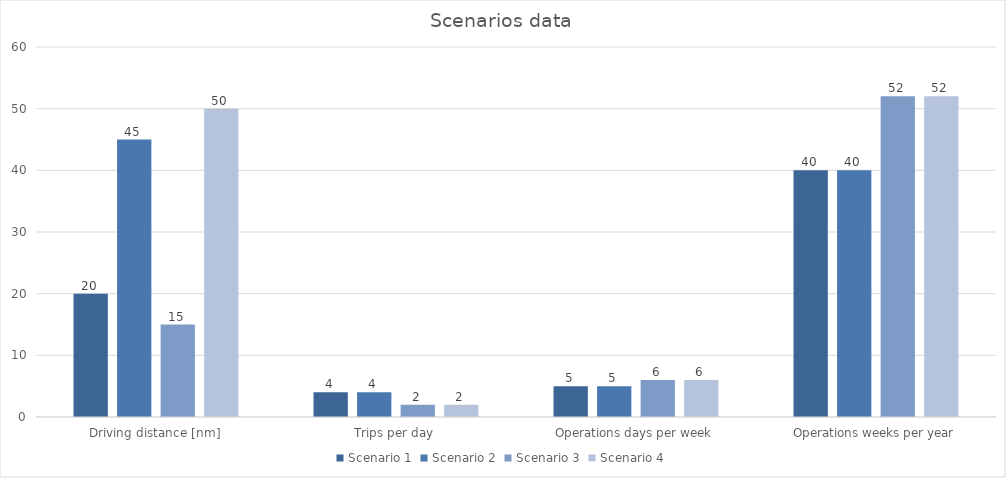
| Category | Scenario 1 | Scenario 2 | Scenario 3 | Scenario 4 |
|---|---|---|---|---|
| Driving distance [nm] | 20 | 45 | 15 | 50 |
| Trips per day | 4 | 4 | 2 | 2 |
| Operations days per week | 5 | 5 | 6 | 6 |
| Operations weeks per year | 40 | 40 | 52 | 52 |